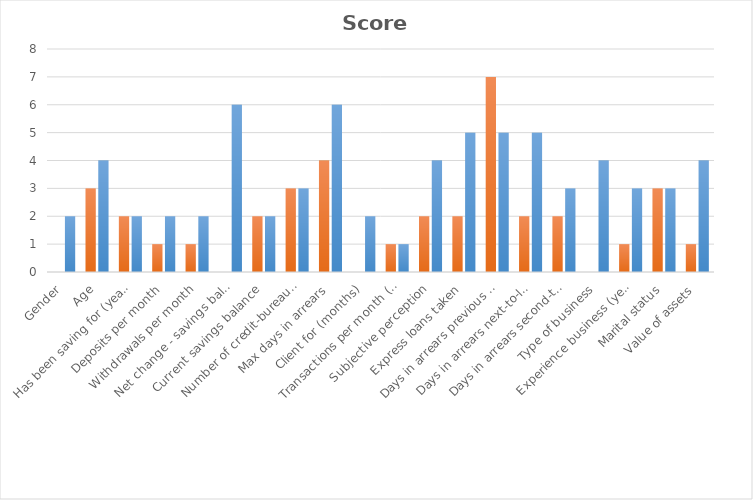
| Category | Attribute score | Max |
|---|---|---|
| Gender | 0 | 2 |
| Age | 3 | 4 |
| Has been saving for (years) | 2 | 2 |
| Deposits per month | 1 | 2 |
| Withdrawals per month | 1 | 2 |
| Net change - savings balance (past 6 months) | 0 | 6 |
| Current savings balance | 2 | 2 |
| Number of credit-bureau queries | 3 | 3 |
| Max days in arrears | 4 | 6 |
| Client for (months) | 0 | 2 |
| Transactions per month (average) | 1 | 1 |
| Subjective perception | 2 | 4 |
| Express loans taken | 2 | 5 |
| Days in arrears previous Express loan | 7 | 5 |
| Days in arrears next-to-last Express loan | 2 | 5 |
| Days in arrears second-to-last Express loan | 2 | 3 |
| Type of business | 0 | 4 |
| Experience business (years) | 1 | 3 |
| Marital status | 3 | 3 |
| Value of assets | 1 | 4 |